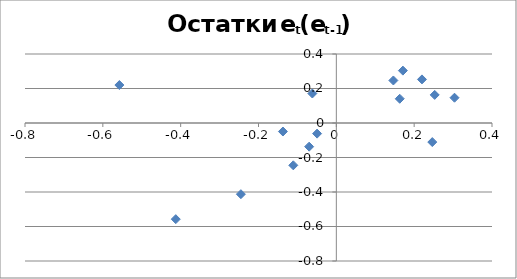
| Category | Остатки et |
|---|---|
| -0.06985300915225867 | -0.137 |
| -0.13719145789035636 | -0.049 |
| -0.04942220578718448 | -0.062 |
| -0.06165295368401402 | 0.171 |
| 0.1710085975778881 | 0.304 |
| 0.3036701488397906 | 0.147 |
| 0.14654710178422903 | 0.247 |
| 0.24654710178423045 | -0.111 |
| -0.11057594527133041 | -0.245 |
| -0.2452528427475258 | -0.413 |
| -0.412591291485624 | -0.557 |
| -0.557483590644356 | 0.22 |
| 0.22007025977627848 | 0.253 |
| 0.2527318110381813 | 0.163 |
| 0.16294721272071833 | 0.141 |